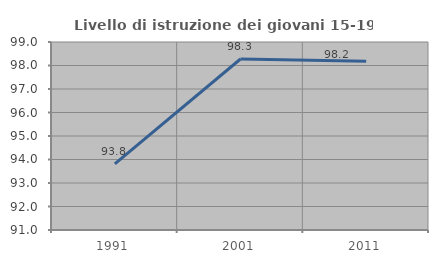
| Category | Livello di istruzione dei giovani 15-19 anni |
|---|---|
| 1991.0 | 93.814 |
| 2001.0 | 98.276 |
| 2011.0 | 98.182 |